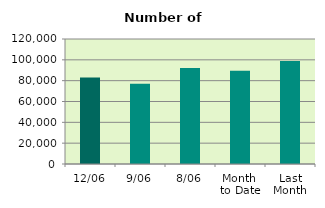
| Category | Series 0 |
|---|---|
| 12/06 | 83028 |
| 9/06 | 77082 |
| 8/06 | 92056 |
| Month 
to Date | 89573 |
| Last
Month | 98885.545 |